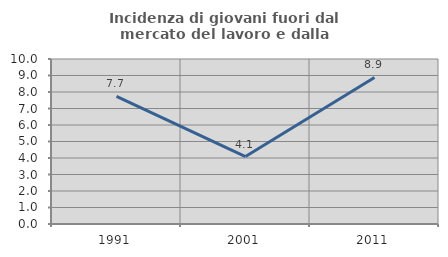
| Category | Incidenza di giovani fuori dal mercato del lavoro e dalla formazione  |
|---|---|
| 1991.0 | 7.735 |
| 2001.0 | 4.088 |
| 2011.0 | 8.882 |